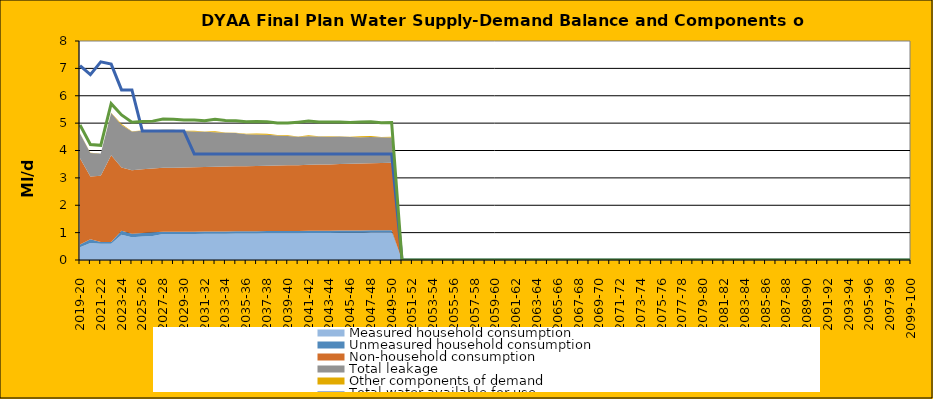
| Category | Total water available for use | Total demand + target headroom (final plan) |
|---|---|---|
| 0 | 7.1 | 4.93 |
| 1 | 6.77 | 4.22 |
| 2 | 7.24 | 4.188 |
| 3 | 7.154 | 5.712 |
| 4 | 6.214 | 5.3 |
| 5 | 6.214 | 5.036 |
| 6 | 4.714 | 5.059 |
| 7 | 4.714 | 5.073 |
| 8 | 4.714 | 5.152 |
| 9 | 4.714 | 5.145 |
| 10 | 4.714 | 5.114 |
| 11 | 3.874 | 5.111 |
| 12 | 3.874 | 5.087 |
| 13 | 3.874 | 5.143 |
| 14 | 3.874 | 5.1 |
| 15 | 3.874 | 5.091 |
| 16 | 3.874 | 5.05 |
| 17 | 3.874 | 5.057 |
| 18 | 3.874 | 5.048 |
| 19 | 3.874 | 5.004 |
| 20 | 3.874 | 5.001 |
| 21 | 3.874 | 5.035 |
| 22 | 3.874 | 5.076 |
| 23 | 3.874 | 5.045 |
| 24 | 3.874 | 5.038 |
| 25 | 3.874 | 5.042 |
| 26 | 3.874 | 5.023 |
| 27 | 3.874 | 5.042 |
| 28 | 3.874 | 5.046 |
| 29 | 3.874 | 5.015 |
| 30 | 3.874 | 5.023 |
| 31 | 0 | 0 |
| 32 | 0 | 0 |
| 33 | 0 | 0 |
| 34 | 0 | 0 |
| 35 | 0 | 0 |
| 36 | 0 | 0 |
| 37 | 0 | 0 |
| 38 | 0 | 0 |
| 39 | 0 | 0 |
| 40 | 0 | 0 |
| 41 | 0 | 0 |
| 42 | 0 | 0 |
| 43 | 0 | 0 |
| 44 | 0 | 0 |
| 45 | 0 | 0 |
| 46 | 0 | 0 |
| 47 | 0 | 0 |
| 48 | 0 | 0 |
| 49 | 0 | 0 |
| 50 | 0 | 0 |
| 51 | 0 | 0 |
| 52 | 0 | 0 |
| 53 | 0 | 0 |
| 54 | 0 | 0 |
| 55 | 0 | 0 |
| 56 | 0 | 0 |
| 57 | 0 | 0 |
| 58 | 0 | 0 |
| 59 | 0 | 0 |
| 60 | 0 | 0 |
| 61 | 0 | 0 |
| 62 | 0 | 0 |
| 63 | 0 | 0 |
| 64 | 0 | 0 |
| 65 | 0 | 0 |
| 66 | 0 | 0 |
| 67 | 0 | 0 |
| 68 | 0 | 0 |
| 69 | 0 | 0 |
| 70 | 0 | 0 |
| 71 | 0 | 0 |
| 72 | 0 | 0 |
| 73 | 0 | 0 |
| 74 | 0 | 0 |
| 75 | 0 | 0 |
| 76 | 0 | 0 |
| 77 | 0 | 0 |
| 78 | 0 | 0 |
| 79 | 0 | 0 |
| 80 | 0 | 0 |